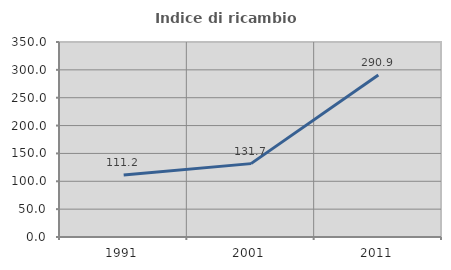
| Category | Indice di ricambio occupazionale  |
|---|---|
| 1991.0 | 111.179 |
| 2001.0 | 131.689 |
| 2011.0 | 290.862 |